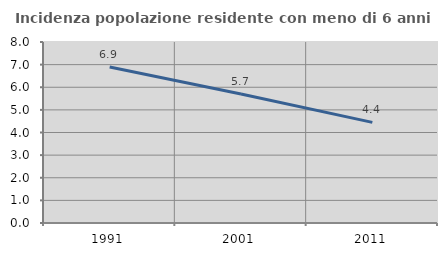
| Category | Incidenza popolazione residente con meno di 6 anni |
|---|---|
| 1991.0 | 6.893 |
| 2001.0 | 5.703 |
| 2011.0 | 4.448 |